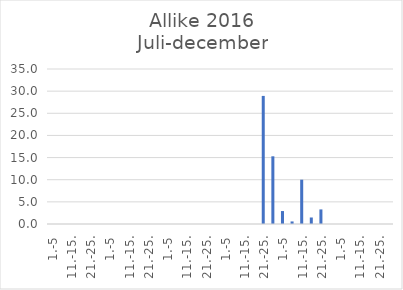
| Category | Series 0 |
|---|---|
| 1.-5 | 0 |
| 6.-10. | 0 |
| 11.-15. | 0 |
| 16.-20. | 0 |
| 21.-25. | 0 |
| 26.-31. | 0 |
| 1.-5 | 0 |
| 6.-10. | 0 |
| 11.-15. | 0 |
| 16.-20. | 0 |
| 21.-25. | 0 |
| 26.-31. | 0 |
| 1.-5 | 0 |
| 6.-10. | 0 |
| 11.-15. | 0 |
| 16.-20. | 0 |
| 21.-25. | 0 |
| 26.-30. | 0 |
| 1.-5 | 0 |
| 6.-10. | 0 |
| 11.-15. | 0 |
| 16.-20. | 0 |
| 21.-25. | 28.923 |
| 26.-31. | 15.287 |
| 1.-5 | 2.926 |
| 6.-10. | 0.579 |
| 11.-15. | 10.005 |
| 16.-20. | 1.471 |
| 21.-25. | 3.293 |
| 26.-30. | 0 |
| 1.-5 | 0 |
| 6.-10. | 0 |
| 11.-15. | 0 |
| 16.-20. | 0 |
| 21.-25. | 0 |
| 26.-31. | 0 |